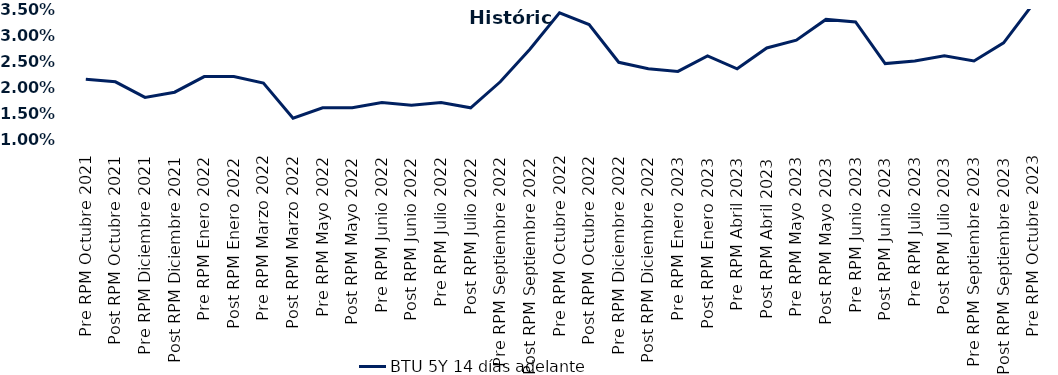
| Category | BTU 5Y 14 días adelante |
|---|---|
| Pre RPM Octubre 2021 | 0.022 |
| Post RPM Octubre 2021 | 0.021 |
| Pre RPM Diciembre 2021 | 0.018 |
| Post RPM Diciembre 2021 | 0.019 |
| Pre RPM Enero 2022 | 0.022 |
| Post RPM Enero 2022 | 0.022 |
| Pre RPM Marzo 2022 | 0.021 |
| Post RPM Marzo 2022 | 0.014 |
| Pre RPM Mayo 2022 | 0.016 |
| Post RPM Mayo 2022 | 0.016 |
| Pre RPM Junio 2022 | 0.017 |
| Post RPM Junio 2022 | 0.016 |
| Pre RPM Julio 2022 | 0.017 |
| Post RPM Julio 2022 | 0.016 |
| Pre RPM Septiembre 2022 | 0.021 |
| Post RPM Septiembre 2022 | 0.027 |
| Pre RPM Octubre 2022 | 0.034 |
| Post RPM Octubre 2022 | 0.032 |
| Pre RPM Diciembre 2022 | 0.025 |
| Post RPM Diciembre 2022 | 0.024 |
| Pre RPM Enero 2023 | 0.023 |
| Post RPM Enero 2023 | 0.026 |
| Pre RPM Abril 2023 | 0.024 |
| Post RPM Abril 2023 | 0.028 |
| Pre RPM Mayo 2023 | 0.029 |
| Post RPM Mayo 2023 | 0.033 |
| Pre RPM Junio 2023 | 0.032 |
| Post RPM Junio 2023 | 0.024 |
| Pre RPM Julio 2023 | 0.025 |
| Post RPM Julio 2023 | 0.026 |
| Pre RPM Septiembre 2023 | 0.025 |
| Post RPM Septiembre 2023 | 0.028 |
| Pre RPM Octubre 2023 | 0.036 |